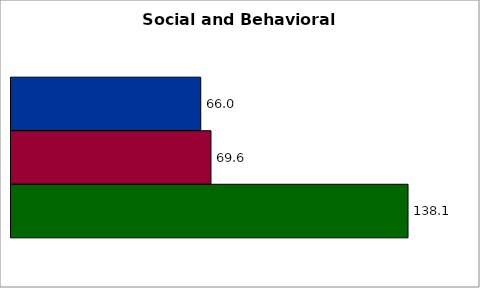
| Category | 50 states and D.C. | SREB states | State |
|---|---|---|---|
| 0 | 66 | 69.552 | 138.095 |